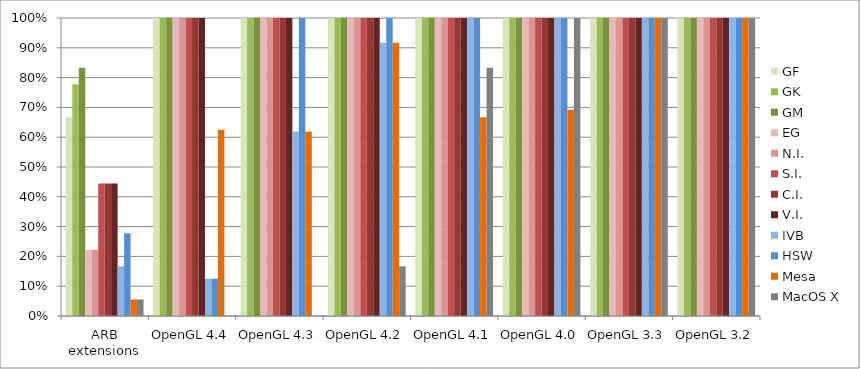
| Category | GF | GK | GM | EG | N.I. | S.I. | C.I. | V.I. | IVB | HSW | Mesa | MacOS X |
|---|---|---|---|---|---|---|---|---|---|---|---|---|
| ARB extensions | 0.667 | 0.778 | 0.833 | 0.222 | 0.222 | 0.444 | 0.444 | 0.444 | 0.167 | 0.278 | 0.056 | 0.056 |
| OpenGL 4.4 | 1 | 1 | 1 | 1 | 1 | 1 | 1 | 1 | 0.125 | 0.125 | 0.625 | 0 |
| OpenGL 4.3 | 1 | 1 | 1 | 1 | 1 | 1 | 1 | 1 | 0.619 | 1 | 0.619 | 0 |
| OpenGL 4.2 | 1 | 1 | 1 | 1 | 1 | 1 | 1 | 1 | 0.917 | 1 | 0.917 | 0.167 |
| OpenGL 4.1 | 1 | 1 | 1 | 1 | 1 | 1 | 1 | 1 | 1 | 1 | 0.667 | 0.833 |
| OpenGL 4.0 | 1 | 1 | 1 | 1 | 1 | 1 | 1 | 1 | 1 | 1 | 0.692 | 1 |
| OpenGL 3.3 | 1 | 1 | 1 | 1 | 1 | 1 | 1 | 1 | 1 | 1 | 1 | 1 |
| OpenGL 3.2 | 1 | 1 | 1 | 1 | 1 | 1 | 1 | 1 | 1 | 1 | 1 | 1 |